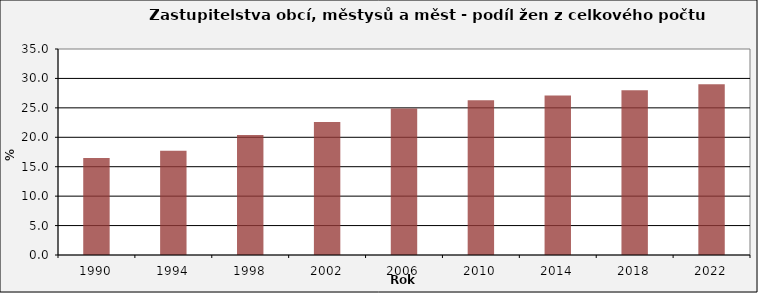
| Category | Podíl žen |
|---|---|
| 1990.0 | 16.5 |
| 1994.0 | 17.7 |
| 1998.0 | 20.4 |
| 2002.0 | 22.6 |
| 2006.0 | 24.9 |
| 2010.0 | 26.3 |
| 2014.0 | 27.1 |
| 2018.0 | 28 |
| 2022.0 | 29 |